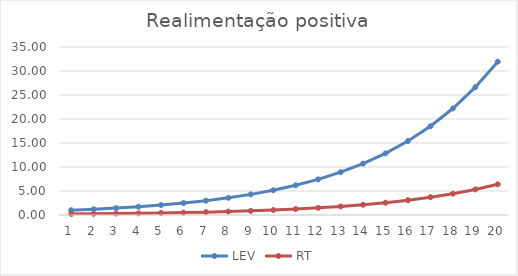
| Category | LEV | RT |
|---|---|---|
| 0 | 1 | 0.2 |
| 1 | 1.2 | 0.24 |
| 2 | 1.44 | 0.288 |
| 3 | 1.728 | 0.346 |
| 4 | 2.074 | 0.415 |
| 5 | 2.488 | 0.498 |
| 6 | 2.986 | 0.597 |
| 7 | 3.583 | 0.717 |
| 8 | 4.3 | 0.86 |
| 9 | 5.16 | 1.032 |
| 10 | 6.192 | 1.238 |
| 11 | 7.43 | 1.486 |
| 12 | 8.916 | 1.783 |
| 13 | 10.699 | 2.14 |
| 14 | 12.839 | 2.568 |
| 15 | 15.407 | 3.081 |
| 16 | 18.488 | 3.698 |
| 17 | 22.186 | 4.437 |
| 18 | 26.623 | 5.325 |
| 19 | 31.948 | 6.39 |